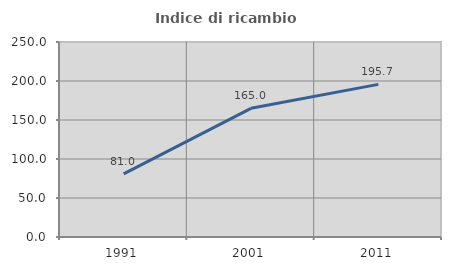
| Category | Indice di ricambio occupazionale  |
|---|---|
| 1991.0 | 80.952 |
| 2001.0 | 165 |
| 2011.0 | 195.652 |